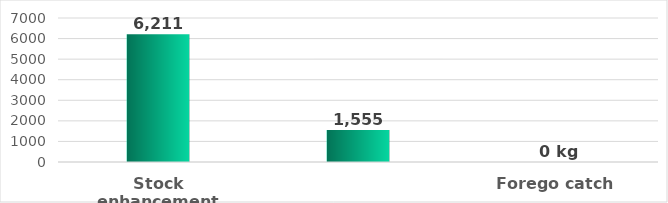
| Category | Series 0 |
|---|---|
| Stock enhancement | 6211.1 |
| Forego catch | 1554.569 |
| Bank investment | 0 |